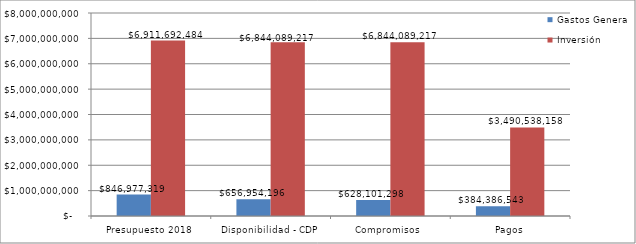
| Category | Gastos Generales  | Inversión |
|---|---|---|
| Presupuesto 2018 | 846977319.2 | 6911692484.008 |
| Disponibilidad - CDP | 656954196 | 6844089217 |
| Compromisos  | 628101298 | 6844089217.008 |
| Pagos | 384386543 | 3490538158 |